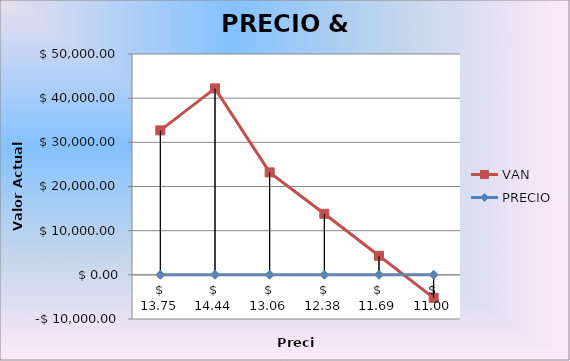
| Category | VAN | PRECIO |
|---|---|---|
| 13.75 | 32707.281 | 13.75 |
| 14.44 | 42219.902 | 14.44 |
| 13.06 | 23194.659 | 13.06 |
| 12.38 | 13819.902 | 12.38 |
| 11.69 | 4307.281 | 11.69 |
| 11.0 | -5205.34 | 11 |